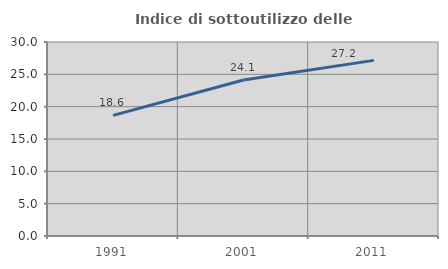
| Category | Indice di sottoutilizzo delle abitazioni  |
|---|---|
| 1991.0 | 18.647 |
| 2001.0 | 24.116 |
| 2011.0 | 27.158 |